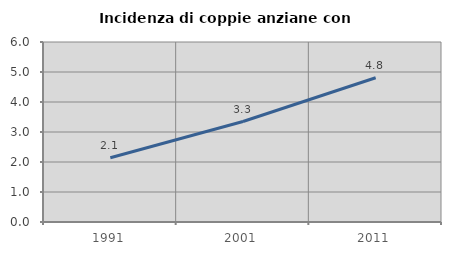
| Category | Incidenza di coppie anziane con figli |
|---|---|
| 1991.0 | 2.143 |
| 2001.0 | 3.349 |
| 2011.0 | 4.807 |